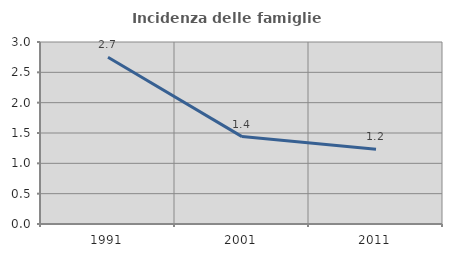
| Category | Incidenza delle famiglie numerose |
|---|---|
| 1991.0 | 2.747 |
| 2001.0 | 1.441 |
| 2011.0 | 1.234 |